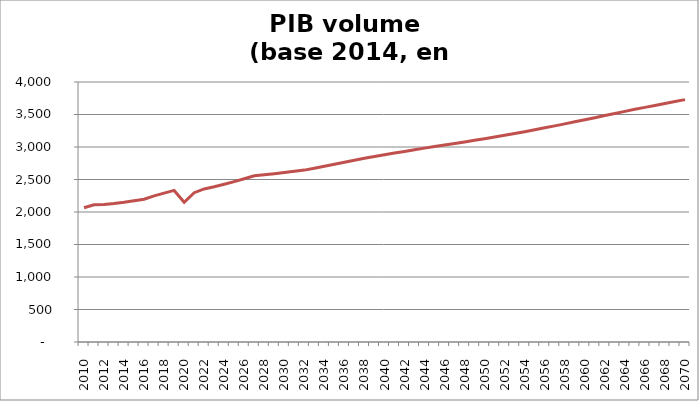
| Category | PIB volume base 2014 |
|---|---|
| 2010.0 | 2065.307 |
| 2011.0 | 2110.593 |
| 2012.0 | 2117.202 |
| 2013.0 | 2129.404 |
| 2014.0 | 2149.765 |
| 2015.0 | 2173.69 |
| 2016.0 | 2197.502 |
| 2017.0 | 2247.856 |
| 2018.0 | 2289.78 |
| 2019.0 | 2331.98 |
| 2020.0 | 2150.445 |
| 2021.0 | 2297.032 |
| 2022.0 | 2355.147 |
| 2023.0 | 2388.119 |
| 2024.0 | 2426.329 |
| 2025.0 | 2468.062 |
| 2026.0 | 2510.512 |
| 2027.0 | 2556.204 |
| 2028.0 | 2573.075 |
| 2029.0 | 2589.8 |
| 2030.0 | 2607.669 |
| 2031.0 | 2626.444 |
| 2032.0 | 2644.567 |
| 2033.0 | 2673.657 |
| 2034.0 | 2703.869 |
| 2035.0 | 2735.505 |
| 2036.0 | 2766.142 |
| 2037.0 | 2795.74 |
| 2038.0 | 2825.655 |
| 2039.0 | 2854.759 |
| 2040.0 | 2881.593 |
| 2041.0 | 2907.24 |
| 2042.0 | 2932.242 |
| 2043.0 | 2957.166 |
| 2044.0 | 2982.598 |
| 2045.0 | 3007.651 |
| 2046.0 | 3030.51 |
| 2047.0 | 3053.845 |
| 2048.0 | 3077.97 |
| 2049.0 | 3103.517 |
| 2050.0 | 3128.035 |
| 2051.0 | 3153.059 |
| 2052.0 | 3179.545 |
| 2053.0 | 3206.889 |
| 2054.0 | 3235.751 |
| 2055.0 | 3265.843 |
| 2056.0 | 3294.909 |
| 2057.0 | 3325.223 |
| 2058.0 | 3356.147 |
| 2059.0 | 3388.031 |
| 2060.0 | 3419.878 |
| 2061.0 | 3451.341 |
| 2062.0 | 3483.438 |
| 2063.0 | 3516.183 |
| 2064.0 | 3548.532 |
| 2065.0 | 3579.759 |
| 2066.0 | 3609.471 |
| 2067.0 | 3639.79 |
| 2068.0 | 3670 |
| 2069.0 | 3700.094 |
| 2070.0 | 3728.955 |